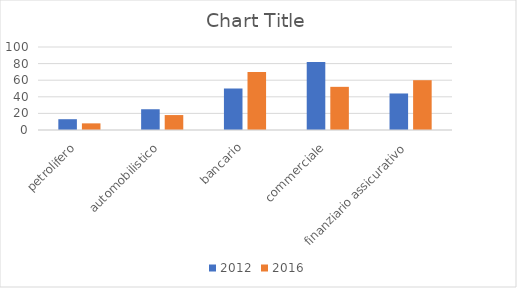
| Category | 2012 | 2016 |
|---|---|---|
| petrolifero | 13 | 8 |
| automobilistico | 25 | 18 |
| bancario | 50 | 70 |
| commerciale | 82 | 52 |
| finanziario assicurativo | 44 | 60 |